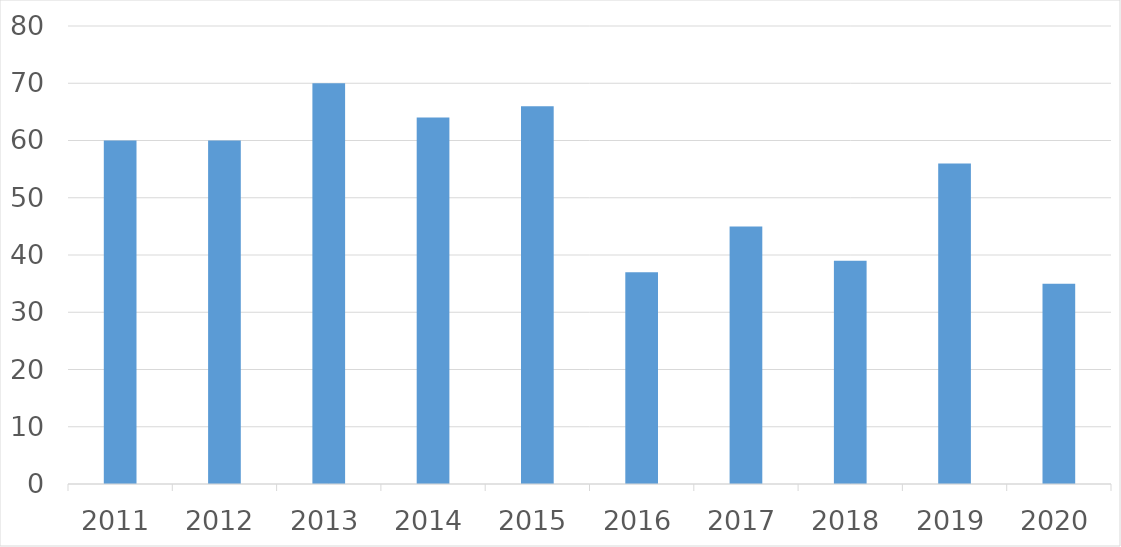
| Category | Series 0 |
|---|---|
| 2011 | 60 |
| 2012 | 60 |
| 2013 | 70 |
| 2014 | 64 |
| 2015 | 66 |
| 2016 | 37 |
| 2017 | 45 |
| 2018 | 39 |
| 2019 | 56 |
| 2020 | 35 |